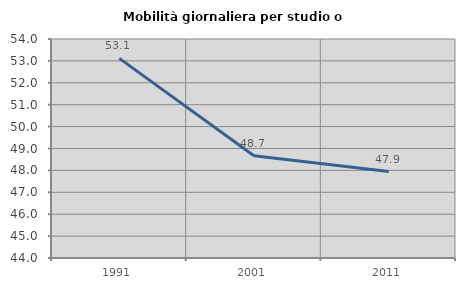
| Category | Mobilità giornaliera per studio o lavoro |
|---|---|
| 1991.0 | 53.115 |
| 2001.0 | 48.67 |
| 2011.0 | 47.948 |